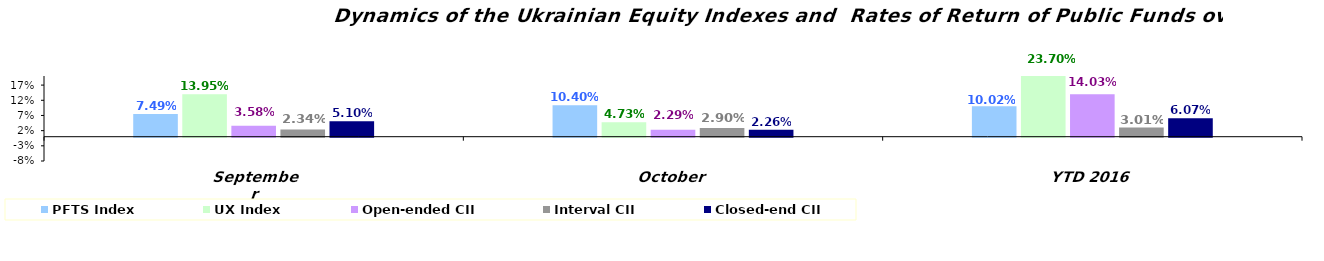
| Category | PFTS Index | UX Index | Open-ended CII | Interval CII | Closed-end CII |
|---|---|---|---|---|---|
| September | 0.075 | 0.14 | 0.036 | 0.023 | 0.051 |
| October | 0.104 | 0.047 | 0.023 | 0.029 | 0.023 |
| YTD 2016 | 0.1 | 0.237 | 0.14 | 0.03 | 0.061 |